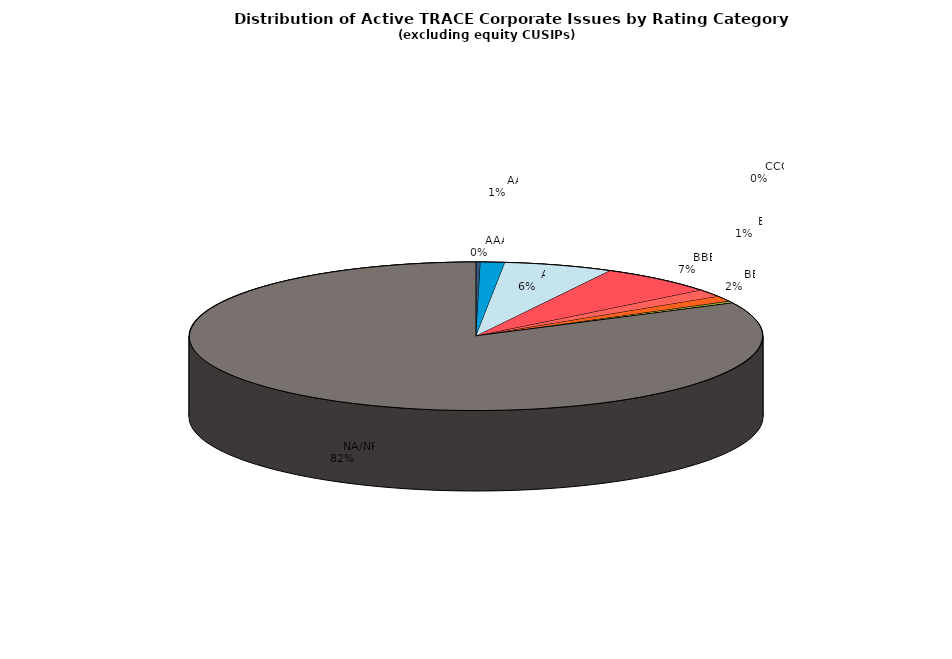
| Category | Series 0 |
|---|---|
|         AAA | 497 |
|         AA | 2647 |
|         A | 11941 |
|         BBB | 12857 |
|         BB | 3236 |
|         B | 2308 |
|         CCC | 773 |
|         CC | 54 |
|         C | 14 |
|         D | 21 |
|         NA/NR | 160180 |